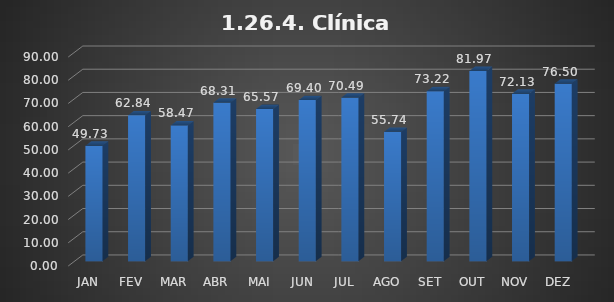
| Category | 1.26.4. Clínica Ginecologica/Obstétrica |
|---|---|
|  JAN  | 49.727 |
|  FEV  | 62.842 |
|  MAR  | 58.47 |
|  ABR  | 68.306 |
|  MAI  | 65.574 |
|  JUN  | 69.399 |
|  JUL  | 70.492 |
|  AGO  | 55.738 |
|  SET  | 73.224 |
|  OUT  | 81.967 |
|  NOV  | 72.131 |
|  DEZ  | 76.503 |